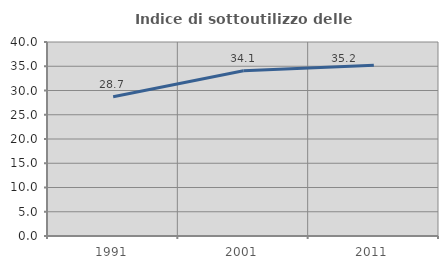
| Category | Indice di sottoutilizzo delle abitazioni  |
|---|---|
| 1991.0 | 28.729 |
| 2001.0 | 34.079 |
| 2011.0 | 35.192 |